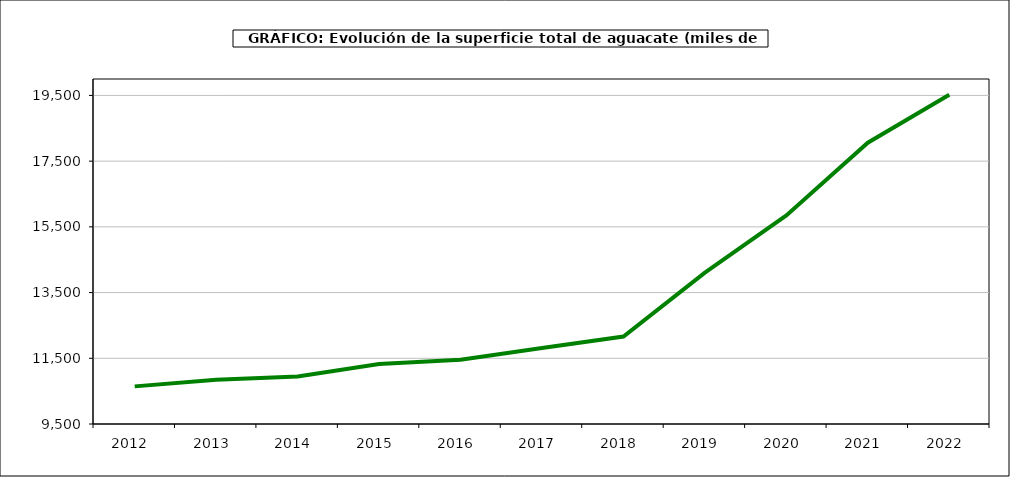
| Category | superficie aguacate |
|---|---|
| 2012.0 | 10645 |
| 2013.0 | 10845 |
| 2014.0 | 10943 |
| 2015.0 | 11329 |
| 2016.0 | 11455 |
| 2017.0 | 11812 |
| 2018.0 | 12161 |
| 2019.0 | 14104 |
| 2020.0 | 15849 |
| 2021.0 | 18061 |
| 2022.0 | 19519 |